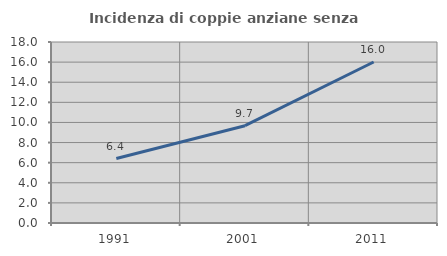
| Category | Incidenza di coppie anziane senza figli  |
|---|---|
| 1991.0 | 6.414 |
| 2001.0 | 9.677 |
| 2011.0 | 16.01 |